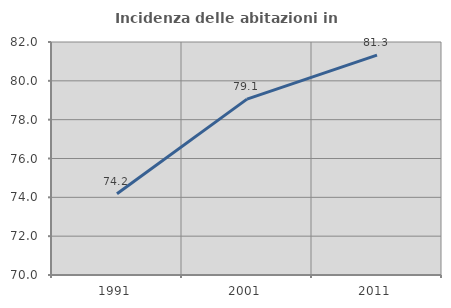
| Category | Incidenza delle abitazioni in proprietà  |
|---|---|
| 1991.0 | 74.189 |
| 2001.0 | 79.057 |
| 2011.0 | 81.321 |